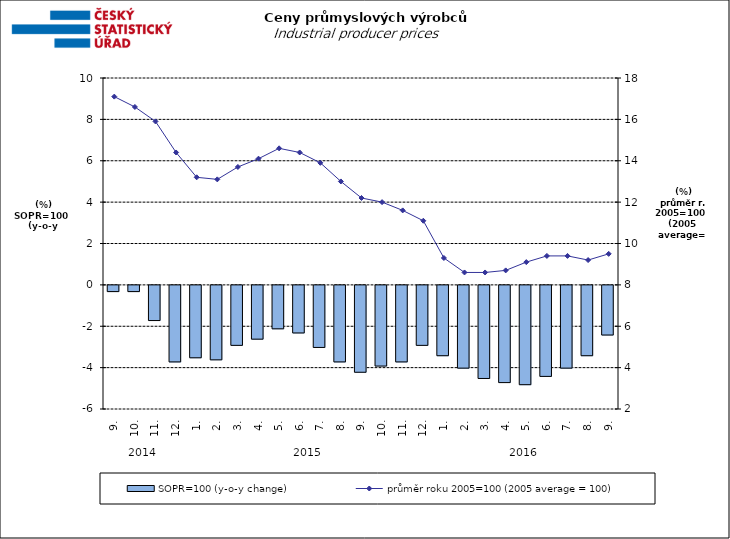
| Category | SOPR=100 (y-o-y change)   |
|---|---|
| 0 | -0.3 |
| 1 | -0.3 |
| 2 | -1.7 |
| 3 | -3.7 |
| 4 | -3.5 |
| 5 | -3.6 |
| 6 | -2.9 |
| 7 | -2.6 |
| 8 | -2.1 |
| 9 | -2.3 |
| 10 | -3 |
| 11 | -3.7 |
| 12 | -4.2 |
| 13 | -3.9 |
| 14 | -3.7 |
| 15 | -2.9 |
| 16 | -3.4 |
| 17 | -4 |
| 18 | -4.5 |
| 19 | -4.7 |
| 20 | -4.8 |
| 21 | -4.4 |
| 22 | -4 |
| 23 | -3.4 |
| 24 | -2.4 |